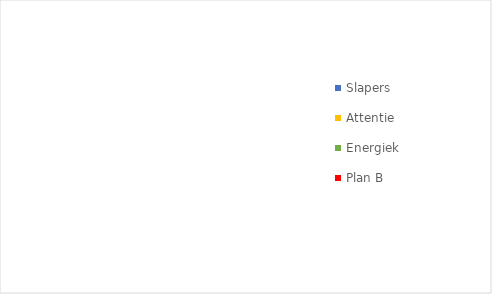
| Category | Series 0 |
|---|---|
| Slapers | 0 |
| Attentie | 0 |
| Energiek | 0 |
| Plan B | 0 |